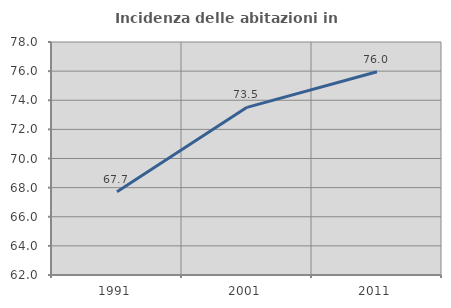
| Category | Incidenza delle abitazioni in proprietà  |
|---|---|
| 1991.0 | 67.716 |
| 2001.0 | 73.512 |
| 2011.0 | 75.957 |